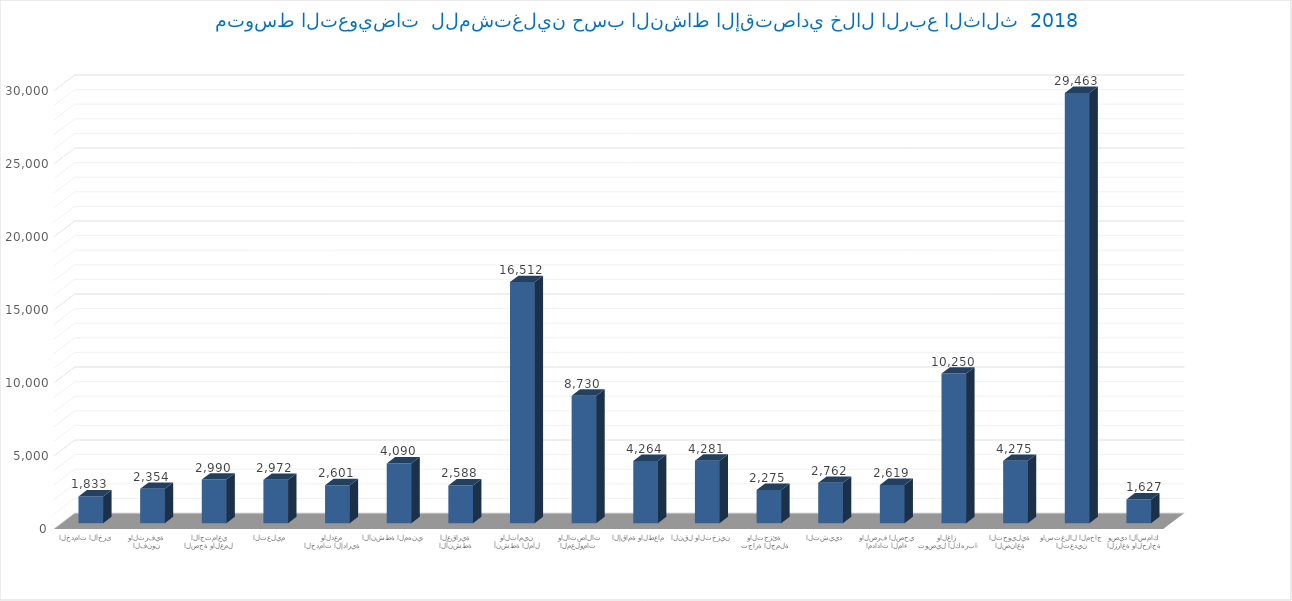
| Category | متوسط التعويضات  |
|---|---|
| الزراعة والحراجة وصيد الأسماك | 1627.318 |
| التعدين واستغلال المحاجر | 29463.229 |
| الصناعة التحويلية | 4274.609 |
| توصيل الكهرباء والغاز  | 10250.423 |
| امدادات الماء والصرف الصحي | 2619.411 |
| التشييد | 2762.363 |
| تجارة الجملة والتجزئة | 2275.496 |
| النقل والتخزين | 4280.713 |
| الإقامة والطعام | 4264.319 |
| المعلومات والاتصالات | 8729.521 |
| أنشطة المال والتأمين | 16512.398 |
| الأنشطة العقارية | 2587.729 |
| الأنشطة المهنية  | 4089.647 |
| الخدمات الإدارية والدعم | 2601.466 |
| التعليم | 2972.41 |
| الصحة والعمل الاجتماعي | 2989.524 |
| الفنون والترفية | 2354.437 |
| الخدمات الأخرى | 1832.91 |